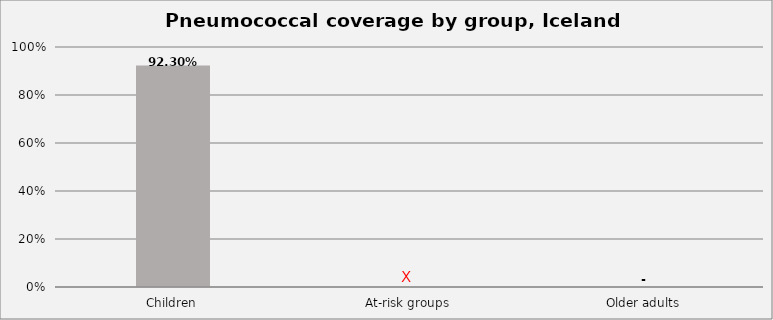
| Category | Series 0 |
|---|---|
| Children | 0.923 |
| At-risk groups | 0 |
| Older adults | 0 |